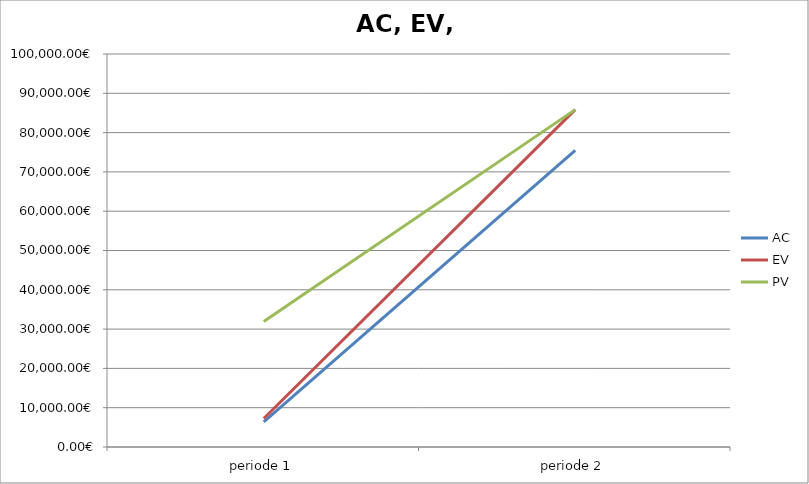
| Category | AC | EV | PV |
|---|---|---|---|
| periode 1 | 6418.97 | 7240.24 | 31908.28 |
| periode 2 | 75468.299 | 85847.889 | 85847.889 |